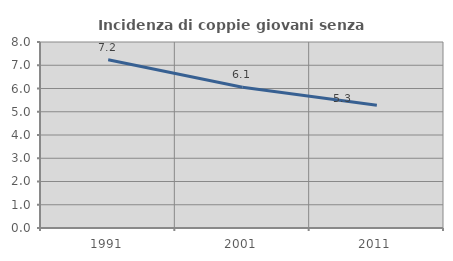
| Category | Incidenza di coppie giovani senza figli |
|---|---|
| 1991.0 | 7.234 |
| 2001.0 | 6.05 |
| 2011.0 | 5.277 |